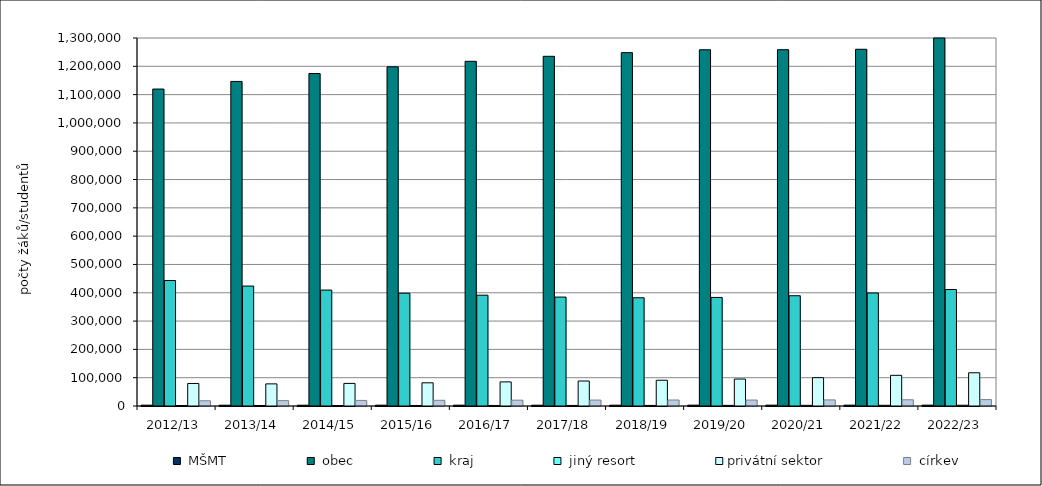
| Category |  MŠMT |  obec |  kraj |  jiný resort | privátní sektor |  církev |
|---|---|---|---|---|---|---|
| 2012/13 | 2931 | 1119660 | 443191 | 1792 | 79647 | 18458 |
| 2013/14 | 2815 | 1146572 | 423695 | 1782 | 78203 | 18969 |
| 2014/15 | 2763 | 1174507 | 409482 | 1690 | 79832 | 19724 |
| 2015/16 | 2903 | 1198133 | 398433 | 1762 | 81907 | 20100 |
| 2016/17 | 2889 | 1217638 | 391446 | 1848 | 85082 | 20584 |
| 2017/18 | 2813 | 1235311 | 384801 | 1941 | 88270 | 20927 |
| 2018/19 | 2911 | 1248266 | 382397 | 2045 | 90976 | 21152 |
| 2019/20 | 3021 | 1258412 | 383527 | 2197 | 95250 | 21076 |
| 2020/21 | 3001 | 1258684 | 389565 | 2329 | 100063 | 21570 |
| 2021/22 | 2987 | 1260189 | 399271 | 2507 | 108313 | 22024 |
| 2022/23 | 3089 | 1307361 | 411492 | 2681 | 117387 | 22649 |